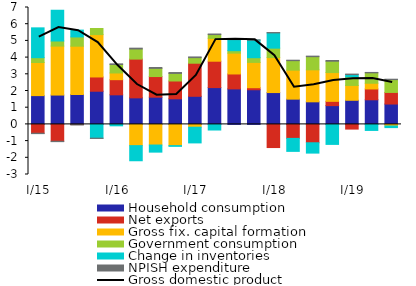
| Category | Household consumption | Net exports | Gross fix. capital formation  | Government consumption | Change in inventories | NPISH expenditure |
|---|---|---|---|---|---|---|
|  I/15 | 1.723 | -0.53 | 1.984 | 0.288 | 1.786 | -0.023 |
| II | 1.757 | -1.01 | 2.932 | 0.304 | 1.842 | -0.022 |
| III | 1.791 | -0.012 | 2.892 | 0.554 | 0.408 | -0.021 |
| IV | 1.986 | 0.854 | 2.539 | 0.364 | -0.825 | -0.016 |
|  I/16 | 1.771 | 0.907 | 0.401 | 0.508 | -0.085 | 0.038 |
| II | 1.59 | 2.32 | -1.272 | 0.607 | -0.905 | 0.048 |
| III | 1.631 | 1.235 | -1.236 | 0.489 | -0.424 | 0.051 |
| IV | 1.532 | 1.067 | -1.271 | 0.454 | -0.044 | 0.052 |
|  I/17 | 1.683 | 1.981 | -0.168 | 0.334 | -0.94 | 0.042 |
| II | 2.204 | 1.58 | 1.37 | 0.224 | -0.336 | 0.035 |
| III | 2.125 | 0.894 | 1.248 | 0.147 | 0.663 | 0.027 |
| IV | 2.075 | 0.121 | 1.516 | 0.282 | 1.052 | 0.017 |
|  I/18 | 1.907 | -1.386 | 2.096 | 0.563 | 0.913 | 0.02 |
| II | 1.512 | -0.838 | 1.737 | 0.568 | -0.778 | 0.026 |
| III | 1.352 | -1.1 | 1.915 | 0.788 | -0.619 | 0.032 |
| IV | 1.124 | 0.256 | 1.725 | 0.679 | -1.197 | 0.043 |
|  I/19 | 1.444 | -0.281 | 0.888 | 0.51 | 0.142 | 0.03 |
| II | 1.474 | 0.648 | 0.343 | 0.624 | -0.361 | 0.024 |
| III | 1.22 | 0.694 | -0.095 | 0.767 | -0.097 | 0.024 |